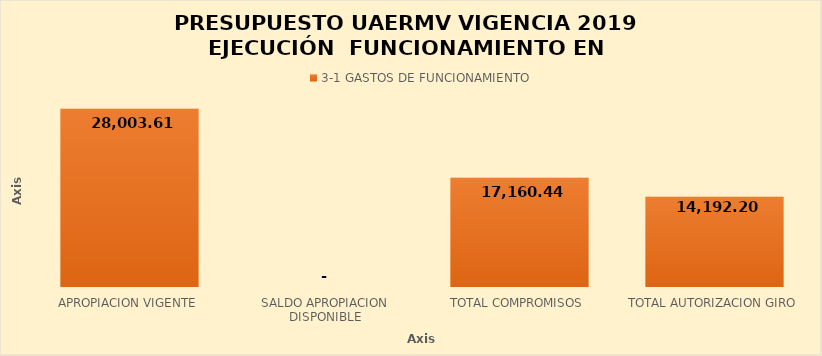
| Category | 3-1 |
|---|---|
| APROPIACION VIGENTE | 28003.61 |
| SALDO APROPIACION DISPONIBLE | 0 |
| TOTAL COMPROMISOS | 17160.444 |
| TOTAL AUTORIZACION GIRO | 14192.2 |